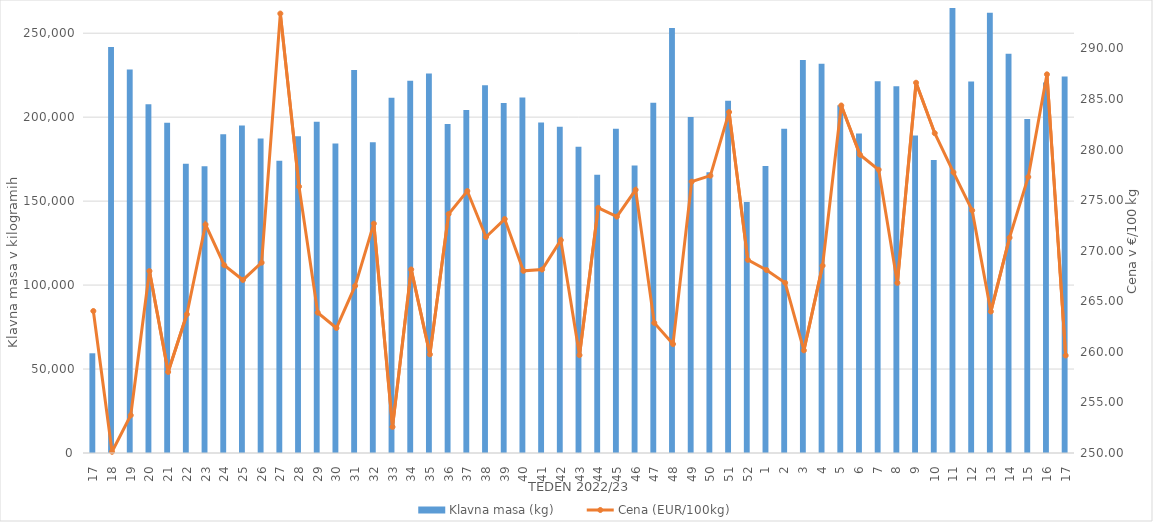
| Category | Klavna masa (kg) |
|---|---|
| 17.0 | 59387 |
| 18.0 | 241833 |
| 19.0 | 228389 |
| 20.0 | 207661 |
| 21.0 | 196732 |
| 22.0 | 172190 |
| 23.0 | 170751 |
| 24.0 | 189775 |
| 25.0 | 195029 |
| 26.0 | 187239 |
| 27.0 | 173967 |
| 28.0 | 188601 |
| 29.0 | 197293 |
| 30.0 | 184259 |
| 31.0 | 228023 |
| 32.0 | 185079 |
| 33.0 | 211612 |
| 34.0 | 221748 |
| 35.0 | 225927 |
| 36.0 | 195924 |
| 37.0 | 204224 |
| 38.0 | 218966 |
| 39.0 | 208403 |
| 40.0 | 211635 |
| 41.0 | 196841 |
| 42.0 | 194271 |
| 43.0 | 182399 |
| 44.0 | 165696 |
| 45.0 | 193022 |
| 46.0 | 171172 |
| 47.0 | 208597 |
| 48.0 | 253151 |
| 49.0 | 200117 |
| 50.0 | 167119 |
| 51.0 | 209797 |
| 52.0 | 149439 |
| 1.0 | 170843 |
| 2.0 | 193093 |
| 3.0 | 234042 |
| 4.0 | 231737 |
| 5.0 | 207136 |
| 6.0 | 190311 |
| 7.0 | 221366 |
| 8.0 | 218470 |
| 9.0 | 189006 |
| 10.0 | 174425 |
| 11.0 | 265476 |
| 12.0 | 221171 |
| 13.0 | 262102 |
| 14.0 | 237813 |
| 15.0 | 198828 |
| 16.0 | 220686 |
| 17.0 | 224192 |